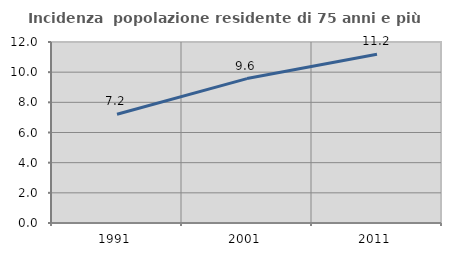
| Category | Incidenza  popolazione residente di 75 anni e più |
|---|---|
| 1991.0 | 7.209 |
| 2001.0 | 9.575 |
| 2011.0 | 11.184 |